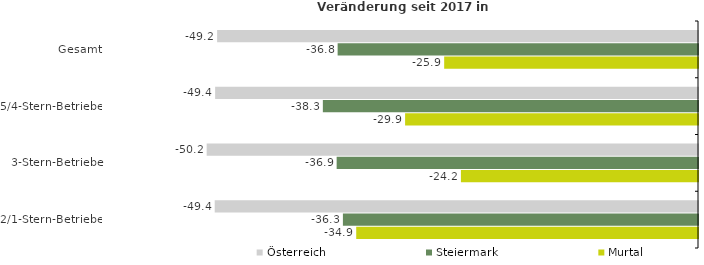
| Category | Österreich | Steiermark | Murtal |
|---|---|---|---|
| Gesamt | -49.154 | -36.835 | -25.944 |
| 5/4-Stern-Betriebe | -49.355 | -38.346 | -29.939 |
| 3-Stern-Betriebe | -50.222 | -36.936 | -24.232 |
| 2/1-Stern-Betriebe | -49.399 | -36.296 | -34.935 |